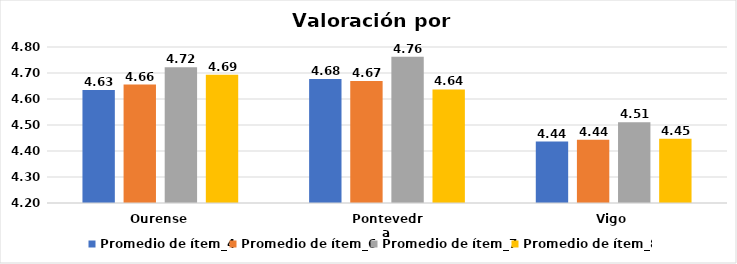
| Category | Promedio de ítem_4 | Promedio de ítem_6 | Promedio de ítem_7 | Promedio de ítem_8 |
|---|---|---|---|---|
| Ourense | 4.635 | 4.656 | 4.722 | 4.694 |
| Pontevedra | 4.677 | 4.669 | 4.763 | 4.637 |
| Vigo | 4.437 | 4.443 | 4.51 | 4.447 |